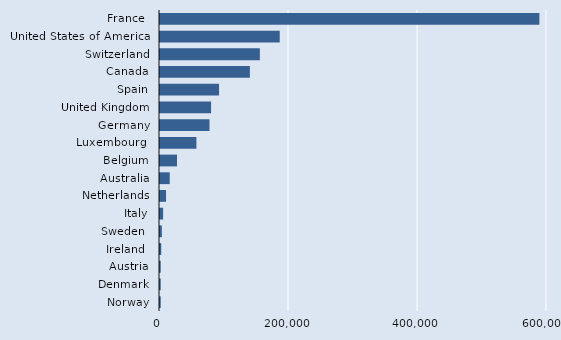
| Category | Series 0 |
|---|---|
| France  | 588218 |
| United States of America  | 185629 |
| Switzerland | 154818 |
| Canada | 139365 |
| Spain | 91585 |
| United Kingdom | 79199 |
| Germany | 76724 |
| Luxembourg  | 56450 |
| Belgium | 26358 |
| Australia | 15101 |
| Netherlands | 9399 |
| Italy | 4835 |
| Sweden  | 2840 |
| Ireland  | 1939 |
| Austria | 1150 |
| Denmark | 1138 |
| Norway | 1126 |